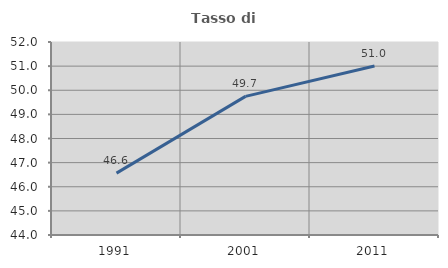
| Category | Tasso di occupazione   |
|---|---|
| 1991.0 | 46.565 |
| 2001.0 | 49.747 |
| 2011.0 | 51.004 |